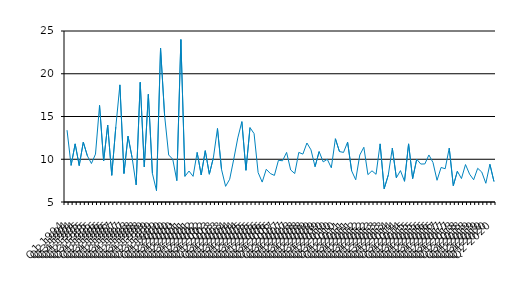
| Category | Series 0 |
|---|---|
| Q1 1994 | 13.4 |
| Q2 1994 | 9.28 |
| Q3 1994 | 11.8 |
| Q4 1994 | 9.26 |
| Q1 1995 | 12 |
| Q2 1995 | 10.4 |
| Q3 1995 | 9.5 |
| Q4 1995 | 10.6 |
| Q1 1996 | 16.3 |
| Q2 1996 | 9.8 |
| Q3 1996 | 14 |
| Q4 1996 | 8.12 |
| Q1 1997 | 13.8 |
| Q2 1997 | 18.7 |
| Q3 1997 | 8.33 |
| Q4 1997 | 12.7 |
| Q1 1998 | 10.2 |
| Q2 1998 | 7 |
| Q3 1998 | 19 |
| Q4 1998 | 9.11 |
| Q1 1999 | 17.6 |
| Q2 1999 | 8.33 |
| Q3 1999 | 6.33 |
| Q4 1999 | 23 |
| Q1 2000 | 15.1 |
| Q2 2000 | 10.5 |
| Q3 2000 | 10 |
| Q4 2000 | 7.5 |
| Q1 2001 | 24 |
| Q2 2001 | 8 |
| Q3 2001 | 8.62 |
| Q4 2001 | 8 |
| Q1 2002 | 10.8 |
| Q2 2002 | 8.16 |
| Q3 2002 | 11 |
| Q4 2002 | 8.25 |
| Q1 2003 | 10.2 |
| Q2 2003 | 13.6 |
| Q3 2003 | 8.8 |
| Q4 2003 | 6.83 |
| Q1 2004 | 7.66 |
| Q2 2004 | 10 |
| Q3 2004 | 12.5 |
| Q4 2004 | 14.4 |
| Q1 2005 | 8.71 |
| Q2 2005 | 13.7 |
| Q3 2005 | 13 |
| Q4 2005 | 8.44 |
| Q1 2006 | 7.33 |
| Q2 2006 | 8.83 |
| Q3 2006 | 8.33 |
| Q4 2006 | 8.11 |
| Q1 2007 | 9.88 |
| Q2 2007 | 9.82 |
| Q3 2007 | 10.8 |
| Q4 2007 | 8.75 |
| Q1 2008 | 8.33 |
| Q2 2008 | 10.8 |
| Q3 2008 | 10.6 |
| Q4 2008 | 11.9 |
| Q1 2009 | 11.1 |
| Q2 2009 | 9.13 |
| Q3 2009 | 10.9 |
| Q4 2009 | 9.69 |
| Q1 2010 | 10 |
| Q2 2010 | 9 |
| Q3 2010 | 12.4 |
| Q4 2010 | 10.9 |
| Q1 2011 | 10.8 |
| Q2 2011 | 12 |
| Q3 2011 | 8.64 |
| Q4 2011 | 7.6 |
| Q1 2012 | 10.5 |
| Q2 2012 | 11.4 |
| Q3 2012 | 8.2 |
| Q4 2012 | 8.65 |
| Q1 2013 | 8.24 |
| Q2 2013 | 11.8 |
| Q3 2013 | 6.55 |
| Q4 2013 | 8.14 |
| Q1 2014 | 11.3 |
| Q2 2014 | 7.83 |
| Q3 2014 | 8.67 |
| Q4 2014 | 7.42 |
| Q1 2015 | 11.8 |
| Q2 2015 | 7.74 |
| Q3 2015 | 10 |
| Q4 2015 | 9.44 |
| Q1 2016 | 9.45 |
| Q2 2016 | 10.5 |
| Q3 2016 | 9.62 |
| Q4 2016 | 7.54 |
| Q1 2017 | 9.04 |
| Q2 2017 | 8.89 |
| Q3 2017 | 11.3 |
| Q4 2017 | 6.91 |
| Q1 2018 | 8.6 |
| Q2 2018 | 7.74 |
| Q3 2018 | 9.38 |
| Q4 2018 | 8.26 |
| Q1 2019 | 7.6 |
| Q2 2019 | 8.941 |
| Q3 2019 | 8.5 |
| Q4 2019 | 7.19 |
| Q1 2020 | 9.41 |
| Q2 2020 | 7.4 |